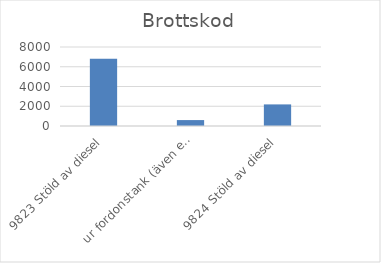
| Category | Summa |
|---|---|
| 9823 Stöld av diesel, ur fordonstank (även entreprenadmaskin m.m.) | 6808 |
| 9824 Stöld av diesel, ur större tankar (ej kopplade till fordon) | 600 |
| 9825 Stöld av drivmedel (även diesel), ej genom smitning | 2187 |